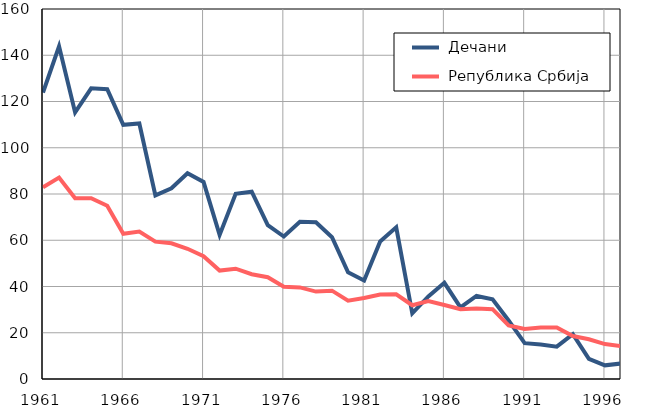
| Category |  Дечани |  Република Србија |
|---|---|---|
| 1961.0 | 123.9 | 82.9 |
| 1962.0 | 143.9 | 87.1 |
| 1963.0 | 115.3 | 78.2 |
| 1964.0 | 125.7 | 78.2 |
| 1965.0 | 125.3 | 74.9 |
| 1966.0 | 109.9 | 62.8 |
| 1967.0 | 110.5 | 63.8 |
| 1968.0 | 79.4 | 59.4 |
| 1969.0 | 82.5 | 58.7 |
| 1970.0 | 89 | 56.3 |
| 1971.0 | 85.2 | 53.1 |
| 1972.0 | 62.3 | 46.9 |
| 1973.0 | 80.1 | 47.7 |
| 1974.0 | 81 | 45.3 |
| 1975.0 | 66.5 | 44 |
| 1976.0 | 61.6 | 39.9 |
| 1977.0 | 68 | 39.6 |
| 1978.0 | 67.8 | 37.8 |
| 1979.0 | 61.3 | 38.2 |
| 1980.0 | 46.1 | 33.9 |
| 1981.0 | 42.6 | 35 |
| 1982.0 | 59.5 | 36.5 |
| 1983.0 | 65.6 | 36.6 |
| 1984.0 | 28.4 | 31.9 |
| 1985.0 | 35.7 | 33.7 |
| 1986.0 | 41.6 | 32 |
| 1987.0 | 31 | 30.2 |
| 1988.0 | 35.9 | 30.5 |
| 1989.0 | 34.5 | 30.2 |
| 1990.0 | 25.3 | 23.2 |
| 1991.0 | 15.5 | 21.6 |
| 1992.0 | 14.9 | 22.3 |
| 1993.0 | 14 | 22.3 |
| 1994.0 | 19.4 | 18.6 |
| 1995.0 | 8.7 | 17.2 |
| 1996.0 | 5.9 | 15.1 |
| 1997.0 | 6.7 | 14.2 |